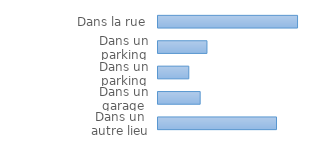
| Category | Ensemble des ménages victimes |
|---|---|
| Dans un autre lieu | 0.312 |
| Dans un garage | 0.111 |
| Dans un parking fermé | 0.081 |
| Dans un parking ouvert | 0.129 |
| Dans la rue | 0.367 |